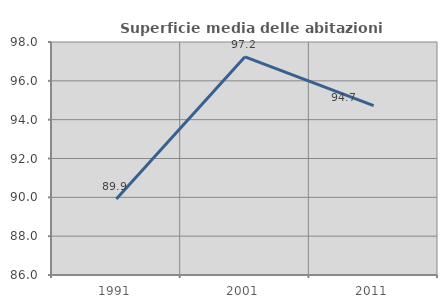
| Category | Superficie media delle abitazioni occupate |
|---|---|
| 1991.0 | 89.918 |
| 2001.0 | 97.235 |
| 2011.0 | 94.723 |